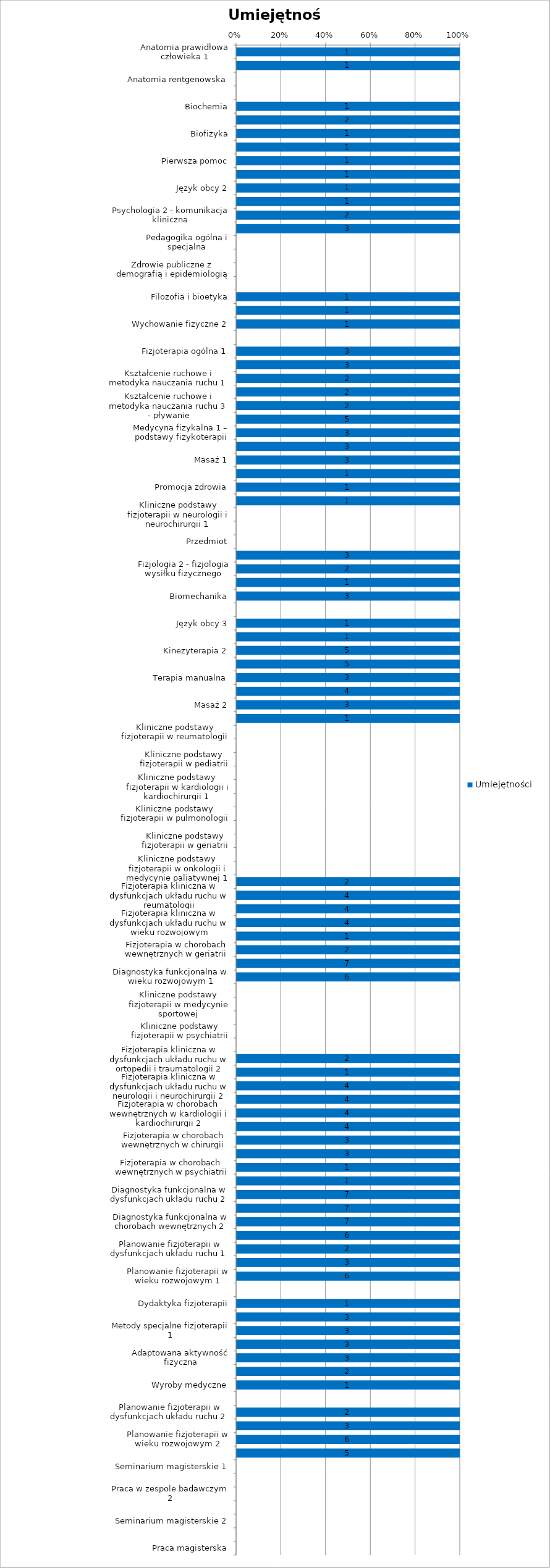
| Category | Umiejętności |
|---|---|
| Anatomia prawidłowa człowieka 1 | 1 |
| Anatomia prawidłowa człowieka 2 | 1 |
| Anatomia rentgenowska | 0 |
| Biologia medyczna z genetyką | 0 |
| Biochemia | 1 |
| Fizjologia 1 - fizjologia ogólna, fizjologia bólu i diagnostyka fizjologiczna | 2 |
| Biofizyka | 1 |
| Ergonomia | 1 |
| Pierwsza pomoc | 1 |
| Język obcy 1 | 1 |
| Język obcy 2 | 1 |
| Psychologia 1 - psychologia ogólna, kliniczna i psychoterapia | 1 |
| Psychologia 2 - komunikacja kliniczna | 2 |
| Socjologia ogólna i niepełnosprawności | 3 |
| Pedagogika ogólna i specjalna | 0 |
| Podstawy prawa | 0 |
| Zdrowie publiczne z demografią i epidemiologią | 0 |
| Ekonomia, system ochrony zdrowia i technologie informacyjne | 0 |
| Filozofia i bioetyka | 1 |
| Wychowanie fizyczne 1 | 1 |
| Wychowanie fizyczne 2 | 1 |
| Historia fizjoterapii | 0 |
| Fizjoterapia ogólna 1 | 3 |
| Fizjoterapia ogólna 2 | 3 |
| Kształcenie ruchowe i metodyka nauczania ruchu 1 | 2 |
| Kształcenie ruchowe i metodyka nauczania ruchu 2 | 2 |
| Kształcenie ruchowe i metodyka nauczania ruchu 3 - pływanie | 2 |
| Kinezyterapia 1 | 5 |
| Medycyna fizykalna 1 – podstawy fizykoterapii | 3 |
| Medycyna fizykalna 2 – nowoczesne metody fizykoterapii | 3 |
| Masaż 1 | 3 |
| Fizjoprofilaktyka | 1 |
| Promocja zdrowia | 1 |
| Kliniczne podstawy fizjoterapii w ortopedii i traumatologii 1 | 1 |
| Kliniczne podstawy fizjoterapii w neurologii i neurochirurgii 1 | 0 |
| Rozwój psychomotoryczny dziecka | 0 |
| Przedmiot | 0 |
| Anatomia palpacyjna i funkcjonalna | 3 |
| Fizjologia 2 - fizjologia wysiłku fizycznego | 2 |
| Farmakologia w fizjoterapii | 1 |
| Biomechanika | 3 |
| Patologia ogólna | 0 |
| Język obcy 3 | 1 |
| Język obcy 4 | 1 |
| Kinezyterapia 2 | 5 |
| Kinezyterapia 3 | 5 |
| Terapia manualna | 3 |
| Medycyna fizykalna 3 – balneoklimatologia i odnowa biologiczna | 4 |
| Masaż 2 | 3 |
| Kliniczne podstawy fizjoterapii w ortopedii i traumatologii 2 | 1 |
| Kliniczne podstawy fizjoterapii w reumatologii | 0 |
| Kliniczne podstawy fizjoterapii w neurologii i neurochirurgii 2 | 0 |
| Kliniczne podstawy fizjoterapii w pediatrii | 0 |
| Kliniczne podstawy fizjoterapii w neurologii dziecięcej | 0 |
| Kliniczne podstawy fizjoterapii w kardiologii i kardiochirurgii 1 | 0 |
| Kliniczne podstawy fizjoterapii w kardiologii i kardiochirurgii 2 | 0 |
| Kliniczne podstawy fizjoterapii w pulmonologii | 0 |
| Kliniczne podstawy fizjoterapii w ginekologii i położnictwie | 0 |
| Kliniczne podstawy fizjoterapii w geriatrii | 0 |
| Kliniczne podstawy fizjoterapii w intensywnej terapii | 0 |
| Kliniczne podstawy fizjoterapii w onkologii i medycynie paliatywnej 1 | 0 |
| Fizjoterapia kliniczna w dysfunkcjach układu ruchu w ortopedii i traumatologii 1 | 2 |
| Fizjoterapia kliniczna w dysfunkcjach układu ruchu w reumatologii | 4 |
| Fizjoterapia kliniczna w dysfunkcjach układu ruchu w neurologii i neurochirurgii 1 | 4 |
| Fizjoterapia kliniczna w dysfunkcjach układu ruchu w wieku rozwojowym | 4 |
| Fizjoterapia w chorobach wewnętrznych w pediatrii | 1 |
| Fizjoterapia w chorobach wewnętrznych w geriatrii | 2 |
| Diagnostyka funkcjonalna w dysfunkcjach układu ruchu 1 | 7 |
| Diagnostyka funkcjonalna w wieku rozwojowym 1 | 6 |
| Przedmiot | 0 |
| Kliniczne podstawy fizjoterapii w medycynie sportowej | 0 |
| Kliniczne podstawy fizjoterapii w chirurgii | 0 |
| Kliniczne podstawy fizjoterapii w psychiatrii | 0 |
| Kliniczne podstawy fizjoterapii w onkologii i medycynie paliatywnej 2 | 0 |
| Fizjoterapia kliniczna w dysfunkcjach układu ruchu w ortopedii i traumatologii 2 | 2 |
| Fizjoterapia kliniczna w dysfunkcjach układu ruchu w medycynie sportowej 1 | 1 |
| Fizjoterapia kliniczna w dysfunkcjach układu ruchu w neurologii i neurochirurgii 2 | 4 |
| Fizjoterapia w chorobach wewnętrznych w kardiologii i kardiochirurgii 1 | 4 |
| Fizjoterapia w chorobach wewnętrznych w kardiologii i kardiochirurgii 2 | 4 |
| Fizjoterapia w chorobach wewnętrznych w pulmonologii | 4 |
| Fizjoterapia w chorobach wewnętrznych w chirurgii  | 3 |
| Fizjoterapia w chorobach wewnętrznych w ginekologii i położnictwie | 3 |
| Fizjoterapia w chorobach wewnętrznych w psychiatrii | 1 |
| Fizjoterapia w chorobach wewnętrznych w onkologii i medycynie paliatywnej | 1 |
| Diagnostyka funkcjonalna w dysfunkcjach układu ruchu 2 | 7 |
| Diagnostyka funkcjonalna w chorobach wewnętrznych 1 | 7 |
| Diagnostyka funkcjonalna w chorobach wewnętrznych 2 | 7 |
| Diagnostyka funkcjonalna w wieku rozwojowym 2 | 6 |
| Planowanie fizjoterapii w dysfunkcjach układu ruchu 1 | 2 |
| Planowanie fizjoterapii w chorobach wewnętrznych 1 | 3 |
| Planowanie fizjoterapii w wieku rozwojowym 1 | 6 |
| Przedmiot | 0 |
| Dydaktyka fizjoterapii | 1 |
| Zarządzanie i marketing | 3 |
| Metody specjalne fizjoterapii 1 | 3 |
| Metody specjalne fizjoterapii 2 | 3 |
| Adaptowana aktywność fizyczna | 3 |
| Sport osób z niepełnosprawnościami | 2 |
| Wyroby medyczne | 1 |
| Fizjoterapia kliniczna w dysfunkcjach układu ruchu w medycynie sportowej 2 | 0 |
| Planowanie fizjoterapii w dysfunkcjach układu ruchu 2 | 2 |
| Planowanie fizjoterapii w chorobach wewnętrznych 2 | 3 |
| Planowanie fizjoterapii w wieku rozwojowym 2 | 6 |
| Metodologia badań naukowych | 5 |
| Seminarium magisterskie 1 | 0 |
| Praca w zespole badawczym 1 | 0 |
| Praca w zespole badawczym 2 | 0 |
| Przedmiot | 0 |
| Seminarium magisterskie 2 | 0 |
| Seminarium magisterskie 3 | 0 |
| Praca magisterska | 0 |